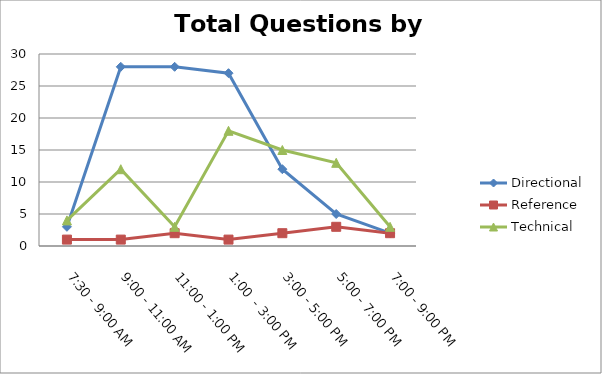
| Category | Directional | Reference | Technical |
|---|---|---|---|
| 7:30 - 9:00 AM | 3 | 1 | 4 |
| 9:00 - 11:00 AM | 28 | 1 | 12 |
| 11:00 - 1:00 PM | 28 | 2 | 3 |
| 1:00  - 3:00 PM | 27 | 1 | 18 |
| 3:00 - 5:00 PM | 12 | 2 | 15 |
| 5:00 - 7:00 PM | 5 | 3 | 13 |
| 7:00 - 9:00 PM | 2 | 2 | 3 |